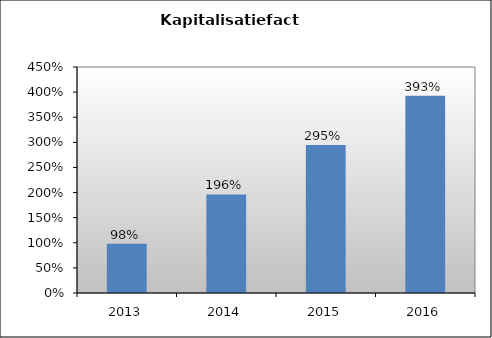
| Category | Series 0 |
|---|---|
| 2013.0 | 0.982 |
| 2014.0 | 1.964 |
| 2015.0 | 2.946 |
| 2016.0 | 3.927 |